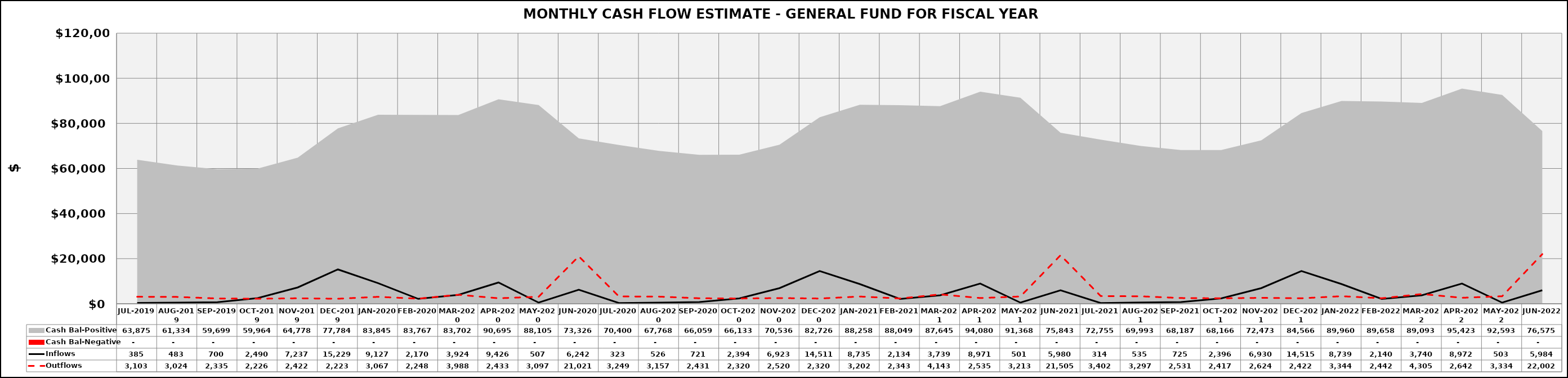
| Category | Inflows | Outflows |
|---|---|---|
| JUL-2019 | 385.05 | 3102.967 |
| AUG-2019 | 482.712 | 3023.783 |
| SEP-2019 | 700.137 | 2334.87 |
| OCT-2019 | 2490.49 | 2226.172 |
| NOV-2019 | 7236.706 | 2421.932 |
| DEC-2019 | 15228.861 | 2222.813 |
| JAN-2020 | 9126.908 | 3066.758 |
| FEB-2020 | 2169.861 | 2247.743 |
| MAR-2020 | 3923.549 | 3988.06 |
| APR-2020 | 9426.024 | 2433.266 |
| MAY-2020 | 506.756 | 3097.142 |
| JUN-2020 | 6242.455 | 21021.089 |
| JUL-2020 | 323.103 | 3248.897 |
| AUG-2020 | 525.502 | 3157.31 |
| SEP-2020 | 721.108 | 2430.584 |
| OCT-2020 | 2393.898 | 2319.572 |
| NOV-2020 | 6922.84 | 2520.499 |
| DEC-2020 | 14510.719 | 2320.19 |
| JAN-2021 | 8734.619 | 3202.33 |
| FEB-2021 | 2133.669 | 2342.727 |
| MAR-2021 | 3738.606 | 4143.17 |
| APR-2021 | 8970.947 | 2535.158 |
| MAY-2021 | 500.792 | 3213.009 |
| JUN-2021 | 5979.799 | 21505.087 |
| JUL-2021 | 313.915 | 3401.938 |
| AUG-2021 | 535.195 | 3297.16 |
| SEP-2021 | 725.112 | 2530.663 |
| OCT-2021 | 2396.269 | 2417.284 |
| NOV-2021 | 6930.105 | 2623.545 |
| DEC-2021 | 14515.046 | 2422.16 |
| JAN-2022 | 8738.949 | 3344.326 |
| FEB-2022 | 2139.973 | 2442.112 |
| MAR-2022 | 3739.508 | 4305.151 |
| APR-2022 | 8972.355 | 2641.748 |
| MAY-2022 | 503.245 | 3333.889 |
| JUN-2022 | 5983.949 | 22001.943 |